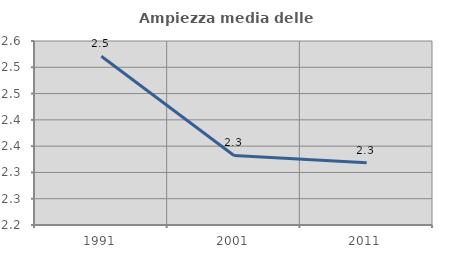
| Category | Ampiezza media delle famiglie |
|---|---|
| 1991.0 | 2.521 |
| 2001.0 | 2.332 |
| 2011.0 | 2.319 |